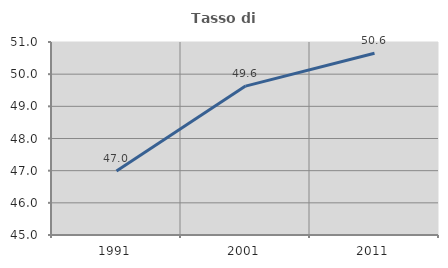
| Category | Tasso di occupazione   |
|---|---|
| 1991.0 | 46.992 |
| 2001.0 | 49.629 |
| 2011.0 | 50.649 |